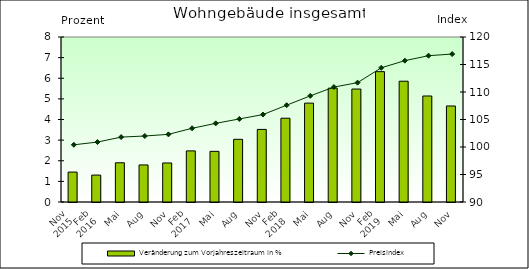
| Category | Veränderung zum Vorjahreszeitraum in % |
|---|---|
| 0 | 1.451 |
| 1 | 1.305 |
| 2 | 1.902 |
| 3 | 1.796 |
| 4 | 1.892 |
| 5 | 2.478 |
| 6 | 2.456 |
| 7 | 3.039 |
| 8 | 3.519 |
| 9 | 4.062 |
| 10 | 4.794 |
| 11 | 5.519 |
| 12 | 5.477 |
| 13 | 6.32 |
| 14 | 5.855 |
| 15 | 5.14 |
| 16 | 4.655 |